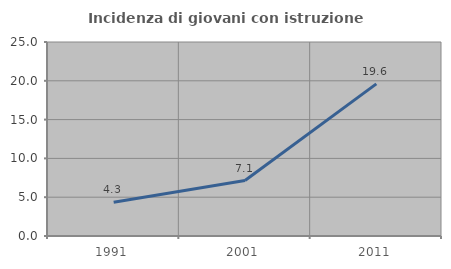
| Category | Incidenza di giovani con istruzione universitaria |
|---|---|
| 1991.0 | 4.348 |
| 2001.0 | 7.143 |
| 2011.0 | 19.608 |